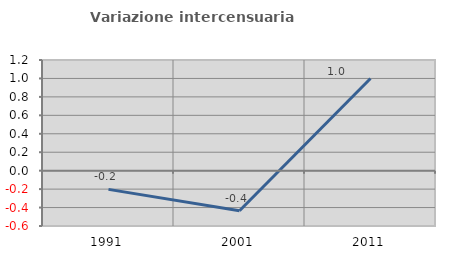
| Category | Variazione intercensuaria annua |
|---|---|
| 1991.0 | -0.203 |
| 2001.0 | -0.435 |
| 2011.0 | 0.999 |